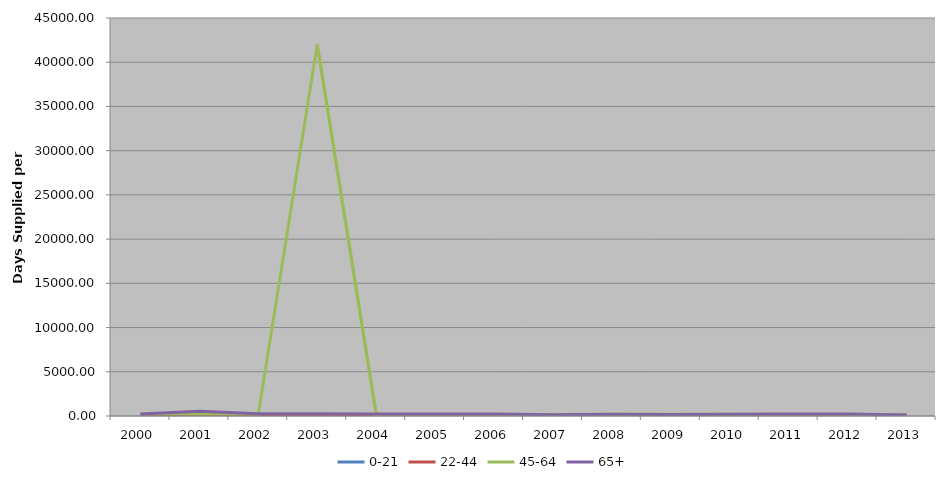
| Category | 0-21 | 22-44 | 45-64 | 65+ |
|---|---|---|---|---|
| 2000 | 127.5 | 127.205 | 214.239 | 232.202 |
| 2001 | 111.778 | 143.774 | 223.178 | 530.725 |
| 2002 | 124.455 | 161.086 | 224.579 | 244.007 |
| 2003 | 92.5 | 152.783 | 42016.69 | 246.796 |
| 2004 | 106.182 | 143.795 | 210.571 | 231.134 |
| 2005 | 84.5 | 134.678 | 197.02 | 218.73 |
| 2006 | 80.227 | 140.088 | 206.416 | 218.944 |
| 2007 | 75.428 | 114.719 | 168.116 | 153.22 |
| 2008 | 95.742 | 128.388 | 184.949 | 202.876 |
| 2009 | 98.589 | 130.558 | 185.512 | 162.91 |
| 2010 | 99.327 | 133.865 | 193.121 | 193.957 |
| 2011 | 93.714 | 135.464 | 200.663 | 213.242 |
| 2012 | 90.404 | 140.12 | 204.048 | 226.393 |
| 2013 | 72.847 | 95.593 | 121.563 | 124.922 |